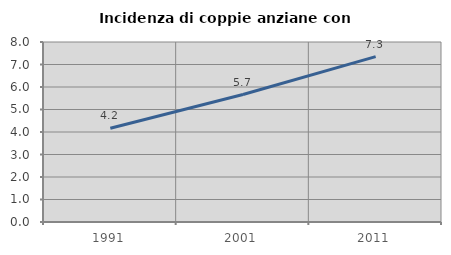
| Category | Incidenza di coppie anziane con figli |
|---|---|
| 1991.0 | 4.167 |
| 2001.0 | 5.666 |
| 2011.0 | 7.349 |